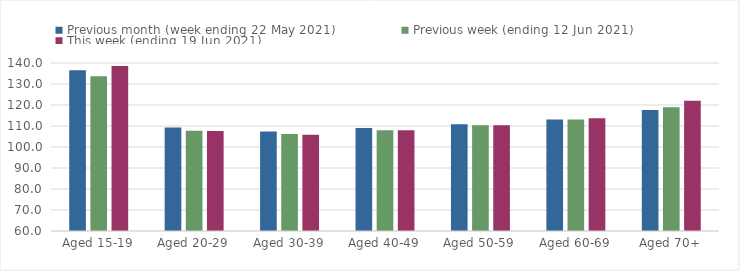
| Category | Previous month (week ending 22 May 2021) | Previous week (ending 12 Jun 2021) | This week (ending 19 Jun 2021) |
|---|---|---|---|
| Aged 15-19 | 136.59 | 133.72 | 138.53 |
| Aged 20-29 | 109.3 | 107.76 | 107.67 |
| Aged 30-39 | 107.39 | 106.2 | 105.82 |
| Aged 40-49 | 109.07 | 108 | 107.99 |
| Aged 50-59 | 110.83 | 110.31 | 110.39 |
| Aged 60-69 | 113.04 | 113.04 | 113.65 |
| Aged 70+ | 117.65 | 118.9 | 122.02 |